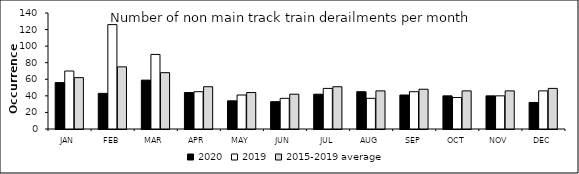
| Category | 2020 | 2019 | 2015-2019 average |
|---|---|---|---|
| JAN | 56 | 70 | 62 |
| FEB | 43 | 126 | 75 |
| MAR | 59 | 90 | 68 |
| APR | 44 | 45 | 51 |
| MAY | 34 | 41 | 44 |
| JUN | 33 | 37 | 42 |
| JUL | 42 | 49 | 51 |
| AUG | 45 | 37 | 46 |
| SEP | 41 | 45 | 48 |
| OCT | 40 | 38 | 46 |
| NOV | 40 | 40 | 46 |
| DEC | 32 | 46 | 49 |